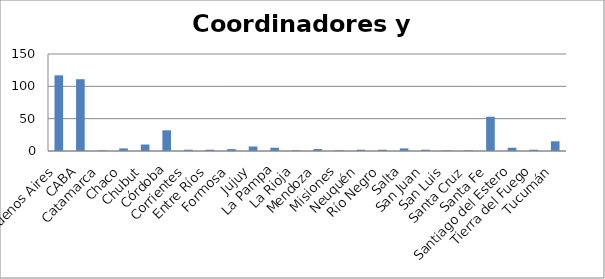
| Category | Series 0 |
|---|---|
| Buenos Aires | 117 |
| CABA | 111 |
| Catamarca | 1 |
| Chaco | 4 |
| Chubut | 10 |
| Córdoba | 32 |
| Corrientes | 2 |
| Entre Ríos | 2 |
| Formosa | 3 |
| Jujuy | 7 |
| La Pampa | 5 |
| La Rioja | 1 |
| Mendoza | 3 |
| Misiones | 1 |
| Neuquén | 2 |
| Río Negro | 2 |
| Salta | 4 |
| San Juan | 2 |
| San Luis | 1 |
| Santa Cruz | 1 |
| Santa Fe | 53 |
| Santiago del Estero | 5 |
| Tierra del Fuego | 2 |
| Tucumán | 15 |